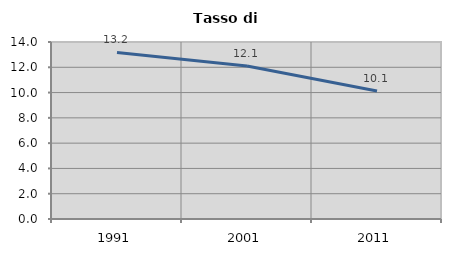
| Category | Tasso di disoccupazione   |
|---|---|
| 1991.0 | 13.172 |
| 2001.0 | 12.096 |
| 2011.0 | 10.124 |